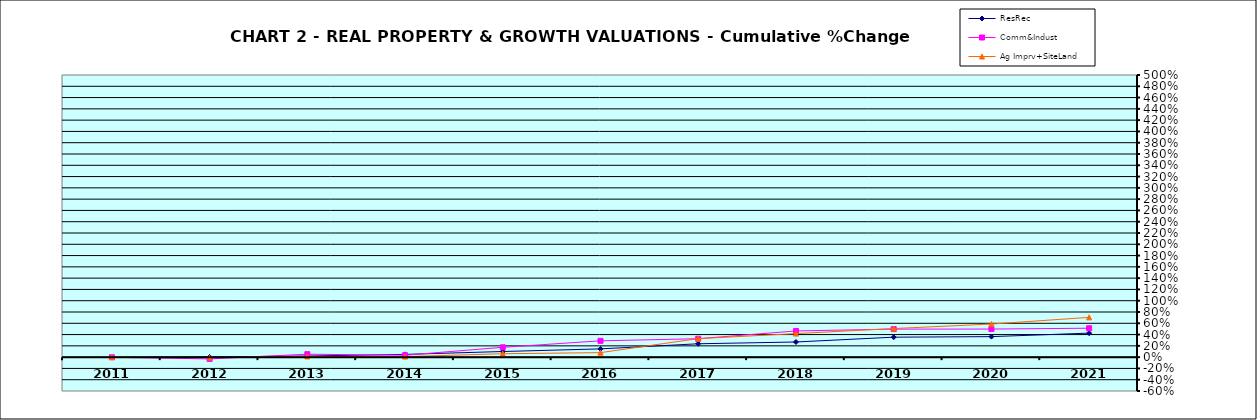
| Category | ResRec | Comm&Indust | Ag Imprv+SiteLand |
|---|---|---|---|
| 2011.0 | -0.005 | -0.002 | 0 |
| 2012.0 | 0.003 | -0.031 | -0.008 |
| 2013.0 | 0.02 | 0.052 | 0.013 |
| 2014.0 | 0.049 | 0.034 | 0.01 |
| 2015.0 | 0.1 | 0.174 | 0.06 |
| 2016.0 | 0.146 | 0.289 | 0.08 |
| 2017.0 | 0.237 | 0.326 | 0.328 |
| 2018.0 | 0.268 | 0.464 | 0.417 |
| 2019.0 | 0.354 | 0.497 | 0.507 |
| 2020.0 | 0.363 | 0.498 | 0.586 |
| 2021.0 | 0.425 | 0.513 | 0.705 |